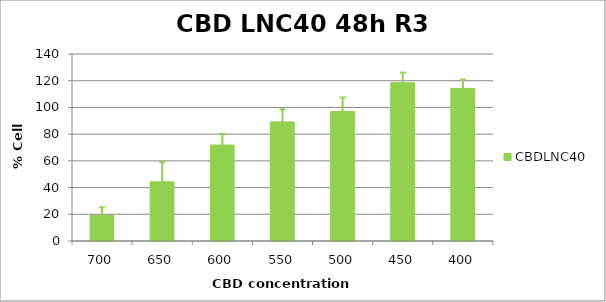
| Category | CBDLNC40 |
|---|---|
| 700.0 | 19.063 |
| 650.0 | 44.306 |
| 600.0 | 71.816 |
| 550.0 | 89.168 |
| 500.0 | 96.95 |
| 450.0 | 118.508 |
| 400.0 | 114.243 |